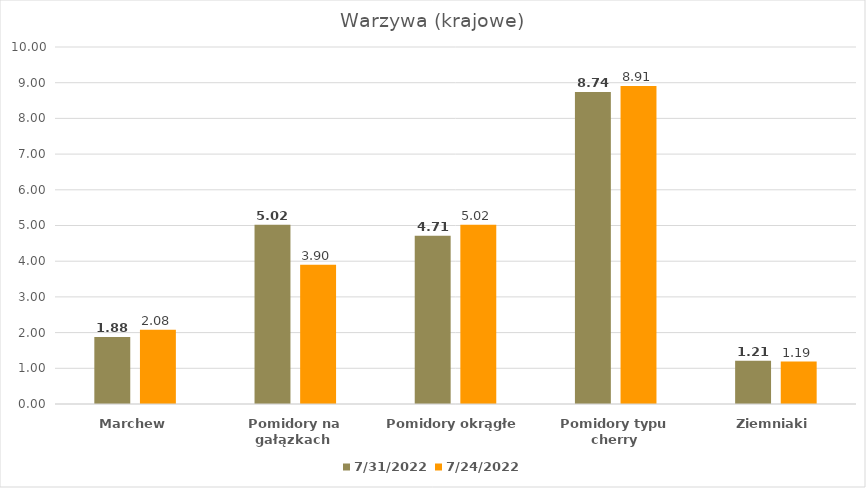
| Category | 2022-07-31 | 2022-07-24 |
|---|---|---|
| Marchew | 1.88 | 2.08 |
| Pomidory na gałązkach  | 5.02 | 3.9 |
| Pomidory okrągłe | 4.71 | 5.02 |
| Pomidory typu cherry | 8.74 | 8.91 |
| Ziemniaki | 1.21 | 1.19 |